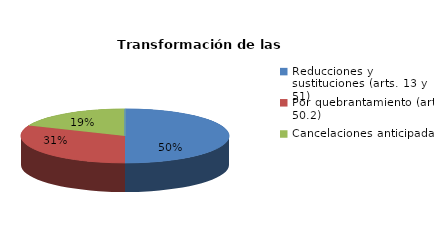
| Category | Series 0 |
|---|---|
| Reducciones y sustituciones (arts. 13 y 51) | 8 |
| Por quebrantamiento (art. 50.2) | 5 |
| Cancelaciones anticipadas | 3 |
| Traslado a Centros Penitenciarios | 0 |
| Conversión internamientos en cerrados (art. 51.2) | 0 |